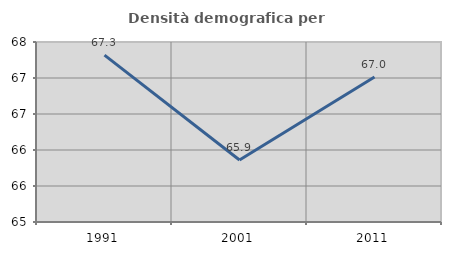
| Category | Densità demografica |
|---|---|
| 1991.0 | 67.318 |
| 2001.0 | 65.861 |
| 2011.0 | 67.014 |